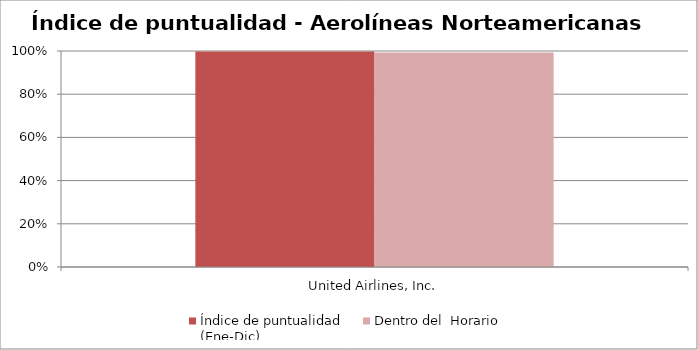
| Category | Índice de puntualidad
(Ene-Dic) | Dentro del  Horario |
|---|---|---|
| United Airlines, Inc. | 0.998 | 0.993 |